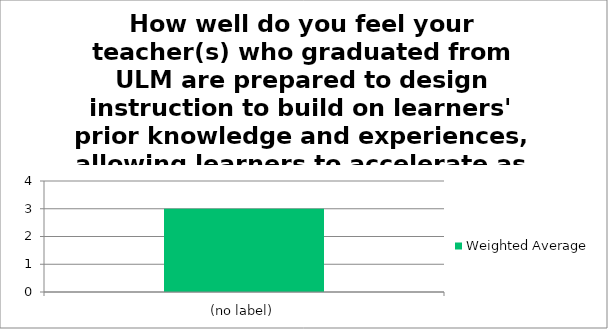
| Category | Weighted Average |
|---|---|
| (no label) | 3 |